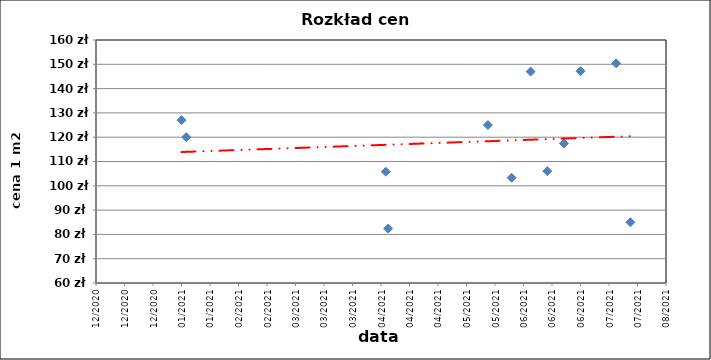
| Category | Series 0 |
|---|---|
| 44208.0 | 127 |
| 44210.0 | 120 |
| 44294.0 | 105.8 |
| 44295.0 | 82.44 |
| 44337.0 | 125 |
| 44347.0 | 103.32 |
| 44355.0 | 147 |
| 44362.0 | 106.03 |
| 44369.0 | 117.42 |
| 44376.0 | 147.17 |
| 44391.0 | 150.38 |
| 44397.0 | 85 |